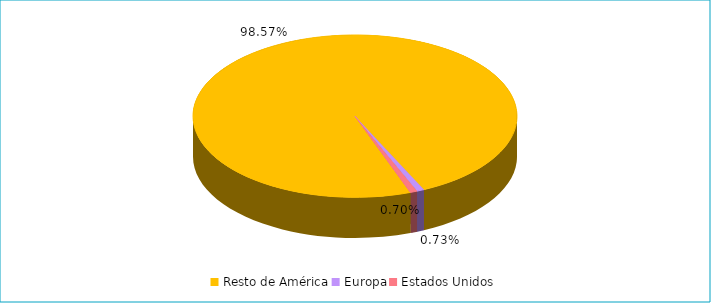
| Category | Series 0 |
|---|---|
| Resto de América | 0.986 |
| Europa | 0.007 |
| Estados Unidos | 0.007 |